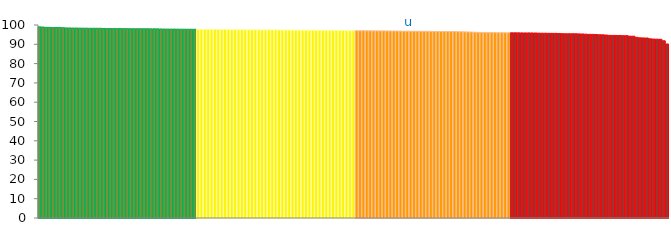
| Category | Top Quartile | 2nd Quartile | 3rd Quartile | Bottom Quartile | Series 4 |
|---|---|---|---|---|---|
|  | 99.05 | 0 | 0 | 0 | 99.05 |
|  | 98.97 | 0 | 0 | 0 | 98.97 |
|  | 98.8 | 0 | 0 | 0 | 98.8 |
|  | 98.76 | 0 | 0 | 0 | 98.76 |
|  | 98.7 | 0 | 0 | 0 | 98.7 |
|  | 98.7 | 0 | 0 | 0 | 98.7 |
|  | 98.68 | 0 | 0 | 0 | 98.68 |
|  | 98.61 | 0 | 0 | 0 | 98.61 |
|  | 98.49 | 0 | 0 | 0 | 98.49 |
|  | 98.48 | 0 | 0 | 0 | 98.48 |
|  | 98.44 | 0 | 0 | 0 | 98.44 |
|  | 98.44 | 0 | 0 | 0 | 98.44 |
|  | 98.4 | 0 | 0 | 0 | 98.4 |
|  | 98.37 | 0 | 0 | 0 | 98.37 |
|  | 98.35 | 0 | 0 | 0 | 98.35 |
|  | 98.32 | 0 | 0 | 0 | 98.32 |
|  | 98.31 | 0 | 0 | 0 | 98.31 |
|  | 98.31 | 0 | 0 | 0 | 98.31 |
|  | 98.31 | 0 | 0 | 0 | 98.31 |
|  | 98.19 | 0 | 0 | 0 | 98.19 |
|  | 98.17 | 0 | 0 | 0 | 98.17 |
|  | 98.15 | 0 | 0 | 0 | 98.15 |
|  | 98.13 | 0 | 0 | 0 | 98.13 |
|  | 98.13 | 0 | 0 | 0 | 98.13 |
|  | 98.13 | 0 | 0 | 0 | 98.13 |
|  | 98.12 | 0 | 0 | 0 | 98.12 |
|  | 98.11 | 0 | 0 | 0 | 98.11 |
|  | 98.07 | 0 | 0 | 0 | 98.07 |
|  | 98.07 | 0 | 0 | 0 | 98.07 |
|  | 98.07 | 0 | 0 | 0 | 98.07 |
|  | 98.06 | 0 | 0 | 0 | 98.06 |
|  | 98.06 | 0 | 0 | 0 | 98.06 |
|  | 98.05 | 0 | 0 | 0 | 98.05 |
|  | 98.01 | 0 | 0 | 0 | 98.01 |
|  | 98.01 | 0 | 0 | 0 | 98.01 |
|  | 98 | 0 | 0 | 0 | 98 |
|  | 97.95 | 0 | 0 | 0 | 97.95 |
|  | 97.91 | 0 | 0 | 0 | 97.91 |
|  | 97.89 | 0 | 0 | 0 | 97.89 |
|  | 97.89 | 0 | 0 | 0 | 97.89 |
|  | 97.88 | 0 | 0 | 0 | 97.88 |
|  | 97.87 | 0 | 0 | 0 | 97.87 |
|  | 97.84 | 0 | 0 | 0 | 97.84 |
|  | 97.83 | 0 | 0 | 0 | 97.83 |
|  | 97.82 | 0 | 0 | 0 | 97.82 |
|  | 97.81 | 0 | 0 | 0 | 97.81 |
|  | 97.81 | 0 | 0 | 0 | 97.81 |
|  | 0 | 97.79 | 0 | 0 | 97.79 |
|  | 0 | 97.74 | 0 | 0 | 97.74 |
|  | 0 | 97.7 | 0 | 0 | 97.7 |
|  | 0 | 97.69 | 0 | 0 | 97.69 |
|  | 0 | 97.68 | 0 | 0 | 97.68 |
|  | 0 | 97.66 | 0 | 0 | 97.66 |
|  | 0 | 97.64 | 0 | 0 | 97.64 |
|  | 0 | 97.64 | 0 | 0 | 97.64 |
|  | 0 | 97.63 | 0 | 0 | 97.63 |
|  | 0 | 97.59 | 0 | 0 | 97.59 |
|  | 0 | 97.55 | 0 | 0 | 97.55 |
|  | 0 | 97.54 | 0 | 0 | 97.54 |
|  | 0 | 97.53 | 0 | 0 | 97.53 |
|  | 0 | 97.53 | 0 | 0 | 97.53 |
|  | 0 | 97.52 | 0 | 0 | 97.52 |
|  | 0 | 97.52 | 0 | 0 | 97.52 |
|  | 0 | 97.51 | 0 | 0 | 97.51 |
|  | 0 | 97.49 | 0 | 0 | 97.49 |
|  | 0 | 97.46 | 0 | 0 | 97.46 |
|  | 0 | 97.46 | 0 | 0 | 97.46 |
|  | 0 | 97.46 | 0 | 0 | 97.46 |
|  | 0 | 97.46 | 0 | 0 | 97.46 |
|  | 0 | 97.44 | 0 | 0 | 97.44 |
|  | 0 | 97.44 | 0 | 0 | 97.44 |
|  | 0 | 97.4 | 0 | 0 | 97.4 |
|  | 0 | 97.38 | 0 | 0 | 97.38 |
|  | 0 | 97.37 | 0 | 0 | 97.37 |
|  | 0 | 97.37 | 0 | 0 | 97.37 |
|  | 0 | 97.33 | 0 | 0 | 97.33 |
|  | 0 | 97.33 | 0 | 0 | 97.33 |
|  | 0 | 97.33 | 0 | 0 | 97.33 |
|  | 0 | 97.31 | 0 | 0 | 97.31 |
|  | 0 | 97.3 | 0 | 0 | 97.3 |
|  | 0 | 97.29 | 0 | 0 | 97.29 |
|  | 0 | 97.26 | 0 | 0 | 97.26 |
|  | 0 | 97.26 | 0 | 0 | 97.26 |
|  | 0 | 97.24 | 0 | 0 | 97.24 |
|  | 0 | 97.23 | 0 | 0 | 97.23 |
|  | 0 | 97.2 | 0 | 0 | 97.2 |
|  | 0 | 97.17 | 0 | 0 | 97.17 |
|  | 0 | 97.14 | 0 | 0 | 97.14 |
|  | 0 | 97.13 | 0 | 0 | 97.13 |
|  | 0 | 97.13 | 0 | 0 | 97.13 |
|  | 0 | 97.11 | 0 | 0 | 97.11 |
|  | 0 | 97.06 | 0 | 0 | 97.06 |
|  | 0 | 97.03 | 0 | 0 | 97.03 |
|  | 0 | 97.03 | 0 | 0 | 97.03 |
|  | 0 | 0 | 97.02 | 0 | 97.02 |
|  | 0 | 0 | 97.02 | 0 | 97.02 |
|  | 0 | 0 | 97.02 | 0 | 97.02 |
|  | 0 | 0 | 96.98 | 0 | 96.98 |
|  | 0 | 0 | 96.97 | 0 | 96.97 |
|  | 0 | 0 | 96.96 | 0 | 96.96 |
|  | 0 | 0 | 96.96 | 0 | 96.96 |
|  | 0 | 0 | 96.95 | 0 | 96.95 |
|  | 0 | 0 | 96.94 | 0 | 96.94 |
|  | 0 | 0 | 96.93 | 0 | 96.93 |
|  | 0 | 0 | 96.9 | 0 | 96.9 |
|  | 0 | 0 | 96.88 | 0 | 96.88 |
|  | 0 | 0 | 96.87 | 0 | 96.87 |
|  | 0 | 0 | 96.83 | 0 | 96.83 |
|  | 0 | 0 | 96.8 | 0 | 96.8 |
|  | 0 | 0 | 96.8 | 0 | 96.8 |
| u | 0 | 0 | 96.79 | 0 | 96.79 |